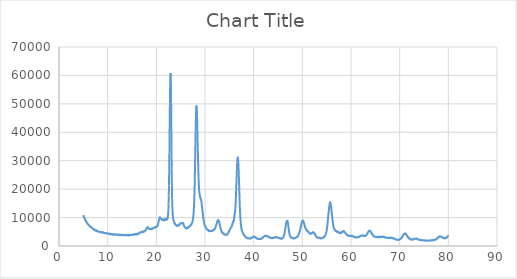
| Category | Series 0 |
|---|---|
| 5.0 | 10862 |
| 5.04 | 10602 |
| 5.08 | 10216 |
| 5.12 | 10194 |
| 5.16 | 10077 |
| 5.2 | 10090 |
| 5.24 | 9739 |
| 5.28 | 9728 |
| 5.32 | 9469 |
| 5.36 | 9317 |
| 5.4 | 9113 |
| 5.44 | 9137 |
| 5.48 | 8998 |
| 5.52 | 8916 |
| 5.56 | 8576 |
| 5.6 | 8645 |
| 5.64 | 8523 |
| 5.68 | 8434 |
| 5.72 | 8157 |
| 5.76 | 8173 |
| 5.8 | 7893 |
| 5.84 | 7918 |
| 5.88 | 7758 |
| 5.92 | 7679 |
| 5.96 | 7673 |
| 6.0 | 7687 |
| 6.04 | 7606 |
| 6.08 | 7361 |
| 6.12 | 7324 |
| 6.16 | 7300 |
| 6.2 | 7283 |
| 6.24 | 7166 |
| 6.28 | 7113 |
| 6.32 | 6834 |
| 6.36 | 6898 |
| 6.4 | 6785 |
| 6.44 | 6750 |
| 6.48 | 6778 |
| 6.52 | 6733 |
| 6.56 | 6751 |
| 6.6 | 6533 |
| 6.64 | 6475 |
| 6.68 | 6540 |
| 6.72 | 6457 |
| 6.76 | 6325 |
| 6.8 | 6323 |
| 6.84 | 6169 |
| 6.88 | 6058 |
| 6.92 | 6093 |
| 6.96 | 6118 |
| 7.0 | 6117 |
| 7.04 | 6037 |
| 7.08 | 6010 |
| 7.12 | 5892 |
| 7.16 | 5725 |
| 7.2 | 5849 |
| 7.24 | 5895 |
| 7.28 | 5747 |
| 7.32 | 5716 |
| 7.36 | 5705 |
| 7.4 | 5432 |
| 7.44 | 5592 |
| 7.48 | 5535 |
| 7.52 | 5392 |
| 7.56 | 5521 |
| 7.6 | 5392 |
| 7.64 | 5516 |
| 7.68 | 5541 |
| 7.72 | 5367 |
| 7.76 | 5412 |
| 7.8 | 5144 |
| 7.84 | 5224 |
| 7.88 | 5275 |
| 7.92 | 5236 |
| 7.96 | 5162 |
| 8.0 | 5179 |
| 8.04 | 5090 |
| 8.08 | 5063 |
| 8.12 | 5085 |
| 8.16 | 5120 |
| 8.2 | 5021 |
| 8.24 | 4968 |
| 8.28 | 4874 |
| 8.32 | 4955 |
| 8.36 | 4914 |
| 8.4 | 4963 |
| 8.44 | 4836 |
| 8.48 | 4874 |
| 8.52 | 4885 |
| 8.56 | 4914 |
| 8.6 | 4904 |
| 8.64 | 4816 |
| 8.68 | 4845 |
| 8.72 | 4829 |
| 8.76 | 4782 |
| 8.8 | 4857 |
| 8.84 | 4798 |
| 8.88 | 4792 |
| 8.92 | 4707 |
| 8.96 | 4732 |
| 9.0 | 4718 |
| 9.04 | 4839 |
| 9.08 | 4691 |
| 9.12 | 4648 |
| 9.16 | 4683 |
| 9.2 | 4551 |
| 9.24 | 4707 |
| 9.28 | 4574 |
| 9.32 | 4594 |
| 9.36 | 4588 |
| 9.4 | 4505 |
| 9.44 | 4561 |
| 9.48 | 4544 |
| 9.52 | 4443 |
| 9.56 | 4509 |
| 9.6 | 4452 |
| 9.64 | 4458 |
| 9.68 | 4550 |
| 9.72 | 4509 |
| 9.76 | 4473 |
| 9.8 | 4422 |
| 9.84 | 4424 |
| 9.88 | 4430 |
| 9.92 | 4418 |
| 9.96 | 4359 |
| 10.0 | 4355 |
| 10.04 | 4425 |
| 10.08 | 4439 |
| 10.12 | 4270 |
| 10.16 | 4288 |
| 10.2 | 4400 |
| 10.24 | 4287 |
| 10.28 | 4296 |
| 10.32 | 4345 |
| 10.36 | 4247 |
| 10.4 | 4330 |
| 10.44 | 4146 |
| 10.48 | 4184 |
| 10.52 | 4122 |
| 10.56 | 4212 |
| 10.6 | 4276 |
| 10.64 | 4188 |
| 10.68 | 4267 |
| 10.72 | 4108 |
| 10.76 | 4065 |
| 10.8 | 4185 |
| 10.84 | 4117 |
| 10.88 | 4182 |
| 10.92 | 4190 |
| 10.96 | 4069 |
| 11.0 | 4174 |
| 11.04 | 4062 |
| 11.08 | 4109 |
| 11.12 | 3894 |
| 11.16 | 4053 |
| 11.2 | 4154 |
| 11.24 | 4186 |
| 11.28 | 4074 |
| 11.32 | 4074 |
| 11.36 | 4028 |
| 11.4 | 4032 |
| 11.44 | 4121 |
| 11.48 | 4061 |
| 11.52 | 4003 |
| 11.56 | 3951 |
| 11.6 | 4024 |
| 11.64 | 4057 |
| 11.68 | 3973 |
| 11.72 | 3982 |
| 11.76 | 3988 |
| 11.8 | 4016 |
| 11.84 | 3958 |
| 11.88 | 4081 |
| 11.92 | 4050 |
| 11.96 | 3971 |
| 12.0 | 3913 |
| 12.04 | 4052 |
| 12.08 | 3912 |
| 12.12 | 3918 |
| 12.16 | 3928 |
| 12.2 | 3906 |
| 12.24 | 3983 |
| 12.28 | 3923 |
| 12.32 | 3877 |
| 12.36 | 3897 |
| 12.4 | 3814 |
| 12.44 | 4002 |
| 12.48 | 3933 |
| 12.52 | 3918 |
| 12.56 | 3882 |
| 12.6 | 3936 |
| 12.64 | 3878 |
| 12.68 | 3915 |
| 12.72 | 3763 |
| 12.76 | 3791 |
| 12.8 | 3916 |
| 12.84 | 3953 |
| 12.88 | 3894 |
| 12.92 | 3820 |
| 12.96 | 3933 |
| 13.0 | 3773 |
| 13.04 | 3789 |
| 13.08 | 3763 |
| 13.12 | 3824 |
| 13.16 | 3860 |
| 13.2 | 3851 |
| 13.24 | 3877 |
| 13.28 | 3862 |
| 13.32 | 3818 |
| 13.36 | 3858 |
| 13.4 | 3787 |
| 13.44 | 3803 |
| 13.48 | 3843 |
| 13.52 | 3880 |
| 13.56 | 3810 |
| 13.6 | 3786 |
| 13.64 | 3774 |
| 13.68 | 3906 |
| 13.72 | 3860 |
| 13.76 | 3906 |
| 13.8 | 3819 |
| 13.84 | 3805 |
| 13.88 | 3752 |
| 13.92 | 3781 |
| 13.96 | 3840 |
| 14.0 | 3863 |
| 14.04 | 3817 |
| 14.08 | 3726 |
| 14.12 | 3924 |
| 14.16 | 3930 |
| 14.2 | 3801 |
| 14.24 | 3910 |
| 14.28 | 3701 |
| 14.32 | 3865 |
| 14.36 | 3774 |
| 14.4 | 3948 |
| 14.44 | 3796 |
| 14.48 | 3986 |
| 14.52 | 3729 |
| 14.56 | 3916 |
| 14.6 | 3921 |
| 14.64 | 3896 |
| 14.68 | 3917 |
| 14.72 | 3892 |
| 14.76 | 3904 |
| 14.8 | 3885 |
| 14.84 | 3860 |
| 14.88 | 3940 |
| 14.92 | 3921 |
| 14.96 | 3915 |
| 15.0 | 3932 |
| 15.04 | 4052 |
| 15.08 | 3915 |
| 15.12 | 3925 |
| 15.16 | 3905 |
| 15.2 | 3981 |
| 15.24 | 4055 |
| 15.28 | 3914 |
| 15.32 | 3976 |
| 15.36 | 3907 |
| 15.4 | 4001 |
| 15.44 | 4011 |
| 15.48 | 4019 |
| 15.52 | 4127 |
| 15.56 | 4002 |
| 15.6 | 4138 |
| 15.64 | 4208 |
| 15.68 | 4037 |
| 15.72 | 4003 |
| 15.76 | 4029 |
| 15.8 | 4037 |
| 15.84 | 4233 |
| 15.88 | 4247 |
| 15.92 | 4234 |
| 15.96 | 4250 |
| 16.0 | 4077 |
| 16.04 | 4169 |
| 16.08 | 4251 |
| 16.12 | 4284 |
| 16.16 | 4100 |
| 16.2 | 4156 |
| 16.24 | 4378 |
| 16.28 | 4248 |
| 16.32 | 4227 |
| 16.36 | 4417 |
| 16.4 | 4485 |
| 16.44 | 4472 |
| 16.48 | 4578 |
| 16.52 | 4537 |
| 16.56 | 4604 |
| 16.6 | 4716 |
| 16.64 | 4626 |
| 16.68 | 4708 |
| 16.72 | 4802 |
| 16.76 | 4833 |
| 16.8 | 4877 |
| 16.84 | 4835 |
| 16.88 | 4877 |
| 16.92 | 4881 |
| 16.96 | 4818 |
| 17.0 | 4897 |
| 17.04 | 4922 |
| 17.08 | 5028 |
| 17.12 | 4904 |
| 17.16 | 5012 |
| 17.2 | 4866 |
| 17.24 | 5032 |
| 17.28 | 5108 |
| 17.32 | 5034 |
| 17.36 | 5120 |
| 17.4 | 4952 |
| 17.44 | 5210 |
| 17.48 | 5017 |
| 17.52 | 5178 |
| 17.56 | 5304 |
| 17.6 | 5297 |
| 17.64 | 5207 |
| 17.68 | 5402 |
| 17.72 | 5324 |
| 17.76 | 5470 |
| 17.8 | 5504 |
| 17.84 | 5783 |
| 17.88 | 5747 |
| 17.92 | 5862 |
| 17.96 | 6055 |
| 18.0 | 6194 |
| 18.04 | 6143 |
| 18.08 | 6476 |
| 18.12 | 6570 |
| 18.16 | 6491 |
| 18.2 | 6648 |
| 18.24 | 6598 |
| 18.28 | 6390 |
| 18.32 | 6555 |
| 18.36 | 6354 |
| 18.4 | 6189 |
| 18.44 | 6196 |
| 18.48 | 5999 |
| 18.52 | 6043 |
| 18.56 | 6017 |
| 18.6 | 6022 |
| 18.64 | 5961 |
| 18.68 | 5984 |
| 18.72 | 5977 |
| 18.76 | 5928 |
| 18.8 | 5862 |
| 18.84 | 5954 |
| 18.88 | 6093 |
| 18.92 | 5928 |
| 18.96 | 6178 |
| 19.0 | 6112 |
| 19.04 | 6005 |
| 19.08 | 6049 |
| 19.12 | 6003 |
| 19.16 | 6028 |
| 19.2 | 6259 |
| 19.24 | 6198 |
| 19.28 | 6130 |
| 19.32 | 6219 |
| 19.36 | 6277 |
| 19.4 | 6349 |
| 19.44 | 6334 |
| 19.48 | 6355 |
| 19.52 | 6400 |
| 19.56 | 6473 |
| 19.6 | 6418 |
| 19.64 | 6424 |
| 19.68 | 6476 |
| 19.72 | 6454 |
| 19.76 | 6530 |
| 19.8 | 6666 |
| 19.84 | 6538 |
| 19.88 | 6582 |
| 19.92 | 6741 |
| 19.96 | 6773 |
| 20.0 | 6723 |
| 20.04 | 6746 |
| 20.08 | 6787 |
| 20.12 | 6926 |
| 20.16 | 6814 |
| 20.2 | 6955 |
| 20.24 | 7171 |
| 20.28 | 7270 |
| 20.32 | 7462 |
| 20.36 | 7758 |
| 20.4 | 8024 |
| 20.44 | 8513 |
| 20.48 | 8620 |
| 20.52 | 8952 |
| 20.56 | 9153 |
| 20.6 | 9650 |
| 20.64 | 9724 |
| 20.68 | 9992 |
| 20.72 | 10135 |
| 20.76 | 10136 |
| 20.8 | 9936 |
| 20.84 | 9952 |
| 20.88 | 9678 |
| 20.92 | 9602 |
| 20.96 | 9713 |
| 21.0 | 9685 |
| 21.04 | 9568 |
| 21.08 | 9372 |
| 21.12 | 9524 |
| 21.16 | 9261 |
| 21.2 | 9161 |
| 21.24 | 9313 |
| 21.28 | 9231 |
| 21.32 | 9121 |
| 21.36 | 9180 |
| 21.4 | 9265 |
| 21.44 | 9156 |
| 21.48 | 9146 |
| 21.52 | 8986 |
| 21.56 | 8941 |
| 21.6 | 8993 |
| 21.64 | 9371 |
| 21.68 | 9420 |
| 21.72 | 9617 |
| 21.76 | 9225 |
| 21.8 | 9286 |
| 21.84 | 9475 |
| 21.88 | 9393 |
| 21.92 | 9488 |
| 21.96 | 9291 |
| 22.0 | 9349 |
| 22.04 | 9193 |
| 22.08 | 9184 |
| 22.12 | 9356 |
| 22.16 | 9381 |
| 22.2 | 9366 |
| 22.24 | 9451 |
| 22.28 | 9588 |
| 22.32 | 9729 |
| 22.36 | 10348 |
| 22.4 | 10933 |
| 22.44 | 11799 |
| 22.48 | 12930 |
| 22.52 | 14975 |
| 22.56 | 17730 |
| 22.6 | 21315 |
| 22.64 | 26408 |
| 22.68 | 32517 |
| 22.72 | 39325 |
| 22.76 | 45615 |
| 22.8 | 51636 |
| 22.84 | 56300 |
| 22.88 | 59660 |
| 22.92 | 60823 |
| 22.96 | 59463 |
| 23.0 | 56002 |
| 23.04 | 50247 |
| 23.08 | 42537 |
| 23.12 | 34187 |
| 23.16 | 26848 |
| 23.2 | 21252 |
| 23.24 | 16734 |
| 23.28 | 14461 |
| 23.32 | 12637 |
| 23.36 | 11551 |
| 23.4 | 10617 |
| 23.44 | 10029 |
| 23.48 | 9452 |
| 23.52 | 9028 |
| 23.56 | 8931 |
| 23.6 | 8782 |
| 23.64 | 8526 |
| 23.68 | 8327 |
| 23.72 | 8164 |
| 23.76 | 7914 |
| 23.8 | 7830 |
| 23.84 | 7879 |
| 23.88 | 7653 |
| 23.92 | 7502 |
| 23.96 | 7391 |
| 24.0 | 7511 |
| 24.04 | 7401 |
| 24.08 | 7406 |
| 24.12 | 7156 |
| 24.16 | 7145 |
| 24.2 | 7100 |
| 24.24 | 7191 |
| 24.28 | 7066 |
| 24.32 | 7188 |
| 24.36 | 7038 |
| 24.4 | 7075 |
| 24.44 | 7127 |
| 24.48 | 7071 |
| 24.52 | 7186 |
| 24.56 | 7268 |
| 24.6 | 7286 |
| 24.64 | 7545 |
| 24.68 | 7361 |
| 24.72 | 7460 |
| 24.76 | 7646 |
| 24.8 | 7685 |
| 24.84 | 7681 |
| 24.88 | 7919 |
| 24.92 | 7905 |
| 24.96 | 7862 |
| 25.0 | 7929 |
| 25.04 | 7839 |
| 25.08 | 7902 |
| 25.12 | 7989 |
| 25.16 | 7968 |
| 25.2 | 7973 |
| 25.24 | 8028 |
| 25.28 | 7952 |
| 25.32 | 7982 |
| 25.36 | 8134 |
| 25.4 | 8095 |
| 25.44 | 8176 |
| 25.48 | 7978 |
| 25.52 | 7810 |
| 25.56 | 7936 |
| 25.6 | 7522 |
| 25.64 | 7371 |
| 25.68 | 7244 |
| 25.72 | 7063 |
| 25.76 | 6911 |
| 25.8 | 6640 |
| 25.84 | 6628 |
| 25.88 | 6624 |
| 25.92 | 6483 |
| 25.96 | 6432 |
| 26.0 | 6491 |
| 26.04 | 6435 |
| 26.08 | 6267 |
| 26.12 | 6297 |
| 26.16 | 6262 |
| 26.2 | 6116 |
| 26.24 | 6231 |
| 26.28 | 6358 |
| 26.32 | 6238 |
| 26.36 | 6374 |
| 26.4 | 6246 |
| 26.44 | 6300 |
| 26.48 | 6620 |
| 26.52 | 6539 |
| 26.56 | 6506 |
| 26.6 | 6534 |
| 26.64 | 6663 |
| 26.68 | 6748 |
| 26.72 | 6641 |
| 26.76 | 6819 |
| 26.8 | 6713 |
| 26.84 | 6847 |
| 26.88 | 6999 |
| 26.92 | 7072 |
| 26.96 | 7058 |
| 27.0 | 7259 |
| 27.04 | 7234 |
| 27.08 | 7358 |
| 27.12 | 7487 |
| 27.16 | 7379 |
| 27.2 | 7524 |
| 27.24 | 7767 |
| 27.28 | 7819 |
| 27.32 | 8024 |
| 27.36 | 8139 |
| 27.4 | 8377 |
| 27.44 | 8628 |
| 27.48 | 8961 |
| 27.52 | 9473 |
| 27.56 | 9739 |
| 27.6 | 10560 |
| 27.64 | 11195 |
| 27.68 | 12100 |
| 27.72 | 13473 |
| 27.76 | 14872 |
| 27.8 | 16775 |
| 27.84 | 19253 |
| 27.88 | 21903 |
| 27.92 | 25263 |
| 27.96 | 29350 |
| 28.0 | 33043 |
| 28.04 | 36657 |
| 28.08 | 40599 |
| 28.12 | 43810 |
| 28.16 | 46409 |
| 28.2 | 48280 |
| 28.24 | 49410 |
| 28.28 | 48979 |
| 28.32 | 48012 |
| 28.36 | 46016 |
| 28.4 | 43648 |
| 28.44 | 40102 |
| 28.48 | 37020 |
| 28.52 | 33798 |
| 28.56 | 31120 |
| 28.6 | 28191 |
| 28.64 | 25703 |
| 28.68 | 23953 |
| 28.72 | 21991 |
| 28.76 | 20804 |
| 28.8 | 19564 |
| 28.84 | 18784 |
| 28.88 | 18474 |
| 28.92 | 17551 |
| 28.96 | 17674 |
| 29.0 | 17280 |
| 29.04 | 16935 |
| 29.08 | 16713 |
| 29.12 | 16831 |
| 29.16 | 16211 |
| 29.2 | 16225 |
| 29.24 | 15604 |
| 29.28 | 15369 |
| 29.32 | 14886 |
| 29.36 | 14091 |
| 29.4 | 13743 |
| 29.44 | 12969 |
| 29.48 | 12473 |
| 29.52 | 11709 |
| 29.56 | 11261 |
| 29.6 | 10525 |
| 29.64 | 9932 |
| 29.68 | 9616 |
| 29.72 | 9169 |
| 29.76 | 8869 |
| 29.8 | 8317 |
| 29.84 | 7916 |
| 29.88 | 7638 |
| 29.92 | 7383 |
| 29.96 | 7267 |
| 30.0 | 7056 |
| 30.04 | 7011 |
| 30.08 | 6811 |
| 30.12 | 6573 |
| 30.16 | 6306 |
| 30.2 | 6325 |
| 30.24 | 6263 |
| 30.28 | 6045 |
| 30.32 | 6033 |
| 30.36 | 6025 |
| 30.4 | 5885 |
| 30.44 | 5848 |
| 30.48 | 5751 |
| 30.52 | 5715 |
| 30.56 | 5517 |
| 30.6 | 5551 |
| 30.64 | 5634 |
| 30.68 | 5422 |
| 30.72 | 5507 |
| 30.76 | 5392 |
| 30.8 | 5229 |
| 30.84 | 5264 |
| 30.88 | 5370 |
| 30.92 | 5394 |
| 30.96 | 5340 |
| 31.0 | 5188 |
| 31.04 | 5329 |
| 31.08 | 5326 |
| 31.12 | 5325 |
| 31.16 | 5311 |
| 31.2 | 5281 |
| 31.24 | 5242 |
| 31.28 | 5260 |
| 31.32 | 5265 |
| 31.36 | 5376 |
| 31.4 | 5428 |
| 31.44 | 5274 |
| 31.48 | 5422 |
| 31.52 | 5396 |
| 31.56 | 5493 |
| 31.6 | 5337 |
| 31.64 | 5554 |
| 31.68 | 5524 |
| 31.72 | 5572 |
| 31.76 | 5618 |
| 31.8 | 5627 |
| 31.84 | 5830 |
| 31.88 | 5785 |
| 31.92 | 5814 |
| 31.96 | 5960 |
| 32.0 | 5994 |
| 32.04 | 6157 |
| 32.08 | 6177 |
| 32.12 | 6411 |
| 32.16 | 6600 |
| 32.2 | 6734 |
| 32.24 | 7041 |
| 32.28 | 7241 |
| 32.32 | 7490 |
| 32.36 | 7640 |
| 32.4 | 7909 |
| 32.44 | 8073 |
| 32.48 | 8545 |
| 32.52 | 8721 |
| 32.56 | 8607 |
| 32.6 | 8871 |
| 32.64 | 8843 |
| 32.68 | 9086 |
| 32.72 | 9181 |
| 32.76 | 9028 |
| 32.8 | 8974 |
| 32.84 | 8824 |
| 32.88 | 8591 |
| 32.92 | 8308 |
| 32.96 | 8108 |
| 33.0 | 7873 |
| 33.04 | 7582 |
| 33.08 | 7245 |
| 33.12 | 6879 |
| 33.16 | 6391 |
| 33.2 | 6194 |
| 33.24 | 6182 |
| 33.28 | 5792 |
| 33.32 | 5457 |
| 33.36 | 5278 |
| 33.4 | 5374 |
| 33.44 | 5072 |
| 33.48 | 4734 |
| 33.52 | 4683 |
| 33.56 | 4712 |
| 33.6 | 4643 |
| 33.64 | 4526 |
| 33.68 | 4451 |
| 33.72 | 4383 |
| 33.76 | 4447 |
| 33.8 | 4332 |
| 33.84 | 4206 |
| 33.88 | 4223 |
| 33.92 | 4079 |
| 33.96 | 4031 |
| 34.0 | 4028 |
| 34.04 | 4049 |
| 34.08 | 4148 |
| 34.12 | 3954 |
| 34.16 | 3917 |
| 34.2 | 3945 |
| 34.24 | 3964 |
| 34.28 | 3912 |
| 34.32 | 3850 |
| 34.36 | 3953 |
| 34.4 | 3934 |
| 34.44 | 4054 |
| 34.48 | 3971 |
| 34.52 | 4134 |
| 34.56 | 4055 |
| 34.6 | 4117 |
| 34.64 | 4310 |
| 34.68 | 4340 |
| 34.72 | 4437 |
| 34.76 | 4518 |
| 34.8 | 4699 |
| 34.84 | 5038 |
| 34.88 | 4858 |
| 34.92 | 5054 |
| 34.96 | 5188 |
| 35.0 | 5371 |
| 35.04 | 5476 |
| 35.08 | 5724 |
| 35.12 | 5734 |
| 35.16 | 5936 |
| 35.2 | 6094 |
| 35.24 | 6217 |
| 35.28 | 6417 |
| 35.32 | 6395 |
| 35.36 | 6619 |
| 35.4 | 6726 |
| 35.44 | 6720 |
| 35.48 | 6744 |
| 35.52 | 7058 |
| 35.56 | 7322 |
| 35.6 | 7345 |
| 35.64 | 7879 |
| 35.68 | 7787 |
| 35.72 | 8297 |
| 35.76 | 8522 |
| 35.8 | 8394 |
| 35.84 | 8671 |
| 35.88 | 8923 |
| 35.92 | 8858 |
| 35.96 | 9440 |
| 36.0 | 10043 |
| 36.04 | 10629 |
| 36.08 | 11024 |
| 36.12 | 11552 |
| 36.16 | 11800 |
| 36.2 | 12328 |
| 36.24 | 13220 |
| 36.28 | 14547 |
| 36.32 | 15983 |
| 36.36 | 17810 |
| 36.4 | 19511 |
| 36.44 | 21617 |
| 36.48 | 23228 |
| 36.52 | 25202 |
| 36.56 | 27263 |
| 36.6 | 28863 |
| 36.64 | 29974 |
| 36.68 | 30898 |
| 36.72 | 31225 |
| 36.76 | 31378 |
| 36.8 | 30518 |
| 36.84 | 29903 |
| 36.88 | 28145 |
| 36.92 | 26495 |
| 36.96 | 24387 |
| 37.0 | 22163 |
| 37.04 | 19894 |
| 37.08 | 17677 |
| 37.12 | 15561 |
| 37.16 | 13697 |
| 37.2 | 12063 |
| 37.24 | 10801 |
| 37.28 | 9671 |
| 37.32 | 8833 |
| 37.36 | 7903 |
| 37.4 | 7235 |
| 37.44 | 6740 |
| 37.48 | 6161 |
| 37.52 | 5883 |
| 37.56 | 5547 |
| 37.6 | 5445 |
| 37.64 | 5092 |
| 37.68 | 4988 |
| 37.72 | 4843 |
| 37.76 | 4516 |
| 37.8 | 4469 |
| 37.84 | 4419 |
| 37.88 | 4270 |
| 37.92 | 4145 |
| 37.96 | 4028 |
| 38.0 | 3836 |
| 38.04 | 3937 |
| 38.08 | 3708 |
| 38.12 | 3629 |
| 38.16 | 3513 |
| 38.2 | 3407 |
| 38.24 | 3451 |
| 38.28 | 3299 |
| 38.32 | 3255 |
| 38.36 | 3159 |
| 38.4 | 3065 |
| 38.44 | 3055 |
| 38.48 | 2941 |
| 38.52 | 2988 |
| 38.56 | 2993 |
| 38.6 | 2845 |
| 38.64 | 2859 |
| 38.68 | 2806 |
| 38.72 | 2803 |
| 38.76 | 2738 |
| 38.8 | 2761 |
| 38.84 | 2723 |
| 38.88 | 2680 |
| 38.92 | 2624 |
| 38.96 | 2671 |
| 39.0 | 2670 |
| 39.04 | 2719 |
| 39.08 | 2634 |
| 39.12 | 2688 |
| 39.16 | 2614 |
| 39.2 | 2708 |
| 39.24 | 2694 |
| 39.28 | 2695 |
| 39.32 | 2556 |
| 39.36 | 2688 |
| 39.4 | 2699 |
| 39.44 | 2768 |
| 39.48 | 2766 |
| 39.52 | 2885 |
| 39.56 | 2762 |
| 39.6 | 2863 |
| 39.64 | 2862 |
| 39.68 | 2942 |
| 39.72 | 3004 |
| 39.76 | 3042 |
| 39.8 | 3143 |
| 39.84 | 3126 |
| 39.88 | 3234 |
| 39.92 | 3243 |
| 39.96 | 3299 |
| 40.0 | 3307 |
| 40.04 | 3166 |
| 40.08 | 3363 |
| 40.12 | 3196 |
| 40.16 | 3240 |
| 40.2 | 3112 |
| 40.24 | 3157 |
| 40.28 | 3077 |
| 40.32 | 3159 |
| 40.36 | 3084 |
| 40.4 | 2991 |
| 40.44 | 2924 |
| 40.48 | 2943 |
| 40.52 | 2779 |
| 40.56 | 2789 |
| 40.6 | 2769 |
| 40.64 | 2611 |
| 40.68 | 2627 |
| 40.72 | 2662 |
| 40.76 | 2508 |
| 40.8 | 2496 |
| 40.84 | 2490 |
| 40.88 | 2501 |
| 40.92 | 2476 |
| 40.96 | 2529 |
| 41.0 | 2475 |
| 41.04 | 2416 |
| 41.08 | 2500 |
| 41.12 | 2467 |
| 41.16 | 2454 |
| 41.2 | 2499 |
| 41.24 | 2479 |
| 41.28 | 2503 |
| 41.32 | 2451 |
| 41.36 | 2472 |
| 41.4 | 2429 |
| 41.44 | 2528 |
| 41.48 | 2556 |
| 41.52 | 2459 |
| 41.56 | 2592 |
| 41.6 | 2723 |
| 41.64 | 2615 |
| 41.68 | 2702 |
| 41.72 | 2760 |
| 41.76 | 2683 |
| 41.8 | 2771 |
| 41.84 | 2902 |
| 41.88 | 2951 |
| 41.92 | 3040 |
| 41.96 | 3123 |
| 42.0 | 3180 |
| 42.04 | 3166 |
| 42.08 | 3251 |
| 42.12 | 3333 |
| 42.16 | 3385 |
| 42.2 | 3469 |
| 42.24 | 3464 |
| 42.28 | 3498 |
| 42.32 | 3485 |
| 42.36 | 3632 |
| 42.4 | 3632 |
| 42.44 | 3562 |
| 42.48 | 3618 |
| 42.52 | 3518 |
| 42.56 | 3617 |
| 42.6 | 3621 |
| 42.64 | 3530 |
| 42.68 | 3502 |
| 42.72 | 3596 |
| 42.76 | 3523 |
| 42.8 | 3436 |
| 42.84 | 3434 |
| 42.88 | 3367 |
| 42.92 | 3361 |
| 42.96 | 3296 |
| 43.0 | 3201 |
| 43.04 | 3238 |
| 43.08 | 3272 |
| 43.12 | 3244 |
| 43.16 | 3171 |
| 43.2 | 3063 |
| 43.24 | 3137 |
| 43.28 | 2957 |
| 43.32 | 3047 |
| 43.36 | 2986 |
| 43.4 | 2879 |
| 43.44 | 2881 |
| 43.48 | 2863 |
| 43.52 | 2834 |
| 43.56 | 2785 |
| 43.6 | 2907 |
| 43.64 | 2847 |
| 43.68 | 2815 |
| 43.72 | 2851 |
| 43.76 | 2778 |
| 43.8 | 2753 |
| 43.84 | 2732 |
| 43.88 | 2748 |
| 43.92 | 2798 |
| 43.96 | 2869 |
| 44.0 | 2834 |
| 44.04 | 2781 |
| 44.08 | 2835 |
| 44.12 | 2900 |
| 44.16 | 2916 |
| 44.2 | 2914 |
| 44.24 | 2876 |
| 44.28 | 2895 |
| 44.32 | 3049 |
| 44.36 | 2944 |
| 44.4 | 3063 |
| 44.44 | 3015 |
| 44.48 | 3210 |
| 44.52 | 3049 |
| 44.56 | 3084 |
| 44.6 | 3035 |
| 44.64 | 3017 |
| 44.68 | 3105 |
| 44.72 | 3050 |
| 44.76 | 3134 |
| 44.8 | 2989 |
| 44.84 | 3084 |
| 44.88 | 2962 |
| 44.92 | 2935 |
| 44.96 | 2985 |
| 45.0 | 2933 |
| 45.04 | 2932 |
| 45.08 | 2845 |
| 45.12 | 2863 |
| 45.16 | 2870 |
| 45.2 | 2818 |
| 45.24 | 2798 |
| 45.28 | 2672 |
| 45.32 | 2792 |
| 45.36 | 2635 |
| 45.4 | 2656 |
| 45.44 | 2686 |
| 45.48 | 2589 |
| 45.52 | 2687 |
| 45.56 | 2741 |
| 45.6 | 2678 |
| 45.64 | 2688 |
| 45.68 | 2481 |
| 45.72 | 2680 |
| 45.76 | 2708 |
| 45.8 | 2597 |
| 45.84 | 2671 |
| 45.88 | 2693 |
| 45.92 | 2721 |
| 45.96 | 2796 |
| 46.0 | 2782 |
| 46.04 | 2926 |
| 46.08 | 2994 |
| 46.12 | 3173 |
| 46.16 | 3291 |
| 46.2 | 3494 |
| 46.24 | 3748 |
| 46.28 | 3994 |
| 46.32 | 4272 |
| 46.36 | 4614 |
| 46.4 | 5074 |
| 46.44 | 5642 |
| 46.48 | 6036 |
| 46.52 | 6462 |
| 46.56 | 6786 |
| 46.6 | 7306 |
| 46.64 | 7663 |
| 46.68 | 8066 |
| 46.72 | 8324 |
| 46.76 | 8556 |
| 46.8 | 8746 |
| 46.84 | 8890 |
| 46.88 | 8894 |
| 46.92 | 8880 |
| 46.96 | 8790 |
| 47.0 | 8380 |
| 47.04 | 8091 |
| 47.08 | 7645 |
| 47.12 | 7082 |
| 47.16 | 6425 |
| 47.2 | 5942 |
| 47.24 | 5417 |
| 47.28 | 4949 |
| 47.32 | 4569 |
| 47.36 | 4231 |
| 47.4 | 3963 |
| 47.44 | 3672 |
| 47.48 | 3441 |
| 47.52 | 3357 |
| 47.56 | 3305 |
| 47.6 | 3119 |
| 47.64 | 3010 |
| 47.68 | 2950 |
| 47.72 | 2893 |
| 47.76 | 2952 |
| 47.8 | 2768 |
| 47.84 | 2811 |
| 47.88 | 2712 |
| 47.92 | 2745 |
| 47.96 | 2759 |
| 48.0 | 2712 |
| 48.04 | 2735 |
| 48.08 | 2838 |
| 48.12 | 2773 |
| 48.16 | 2628 |
| 48.2 | 2759 |
| 48.24 | 2730 |
| 48.28 | 2648 |
| 48.32 | 2706 |
| 48.36 | 2738 |
| 48.4 | 2741 |
| 48.44 | 2783 |
| 48.48 | 2803 |
| 48.52 | 2833 |
| 48.56 | 3001 |
| 48.6 | 2825 |
| 48.64 | 2841 |
| 48.68 | 2870 |
| 48.72 | 3003 |
| 48.76 | 3030 |
| 48.8 | 3109 |
| 48.84 | 3118 |
| 48.88 | 3226 |
| 48.92 | 3173 |
| 48.96 | 3213 |
| 49.0 | 3445 |
| 49.04 | 3353 |
| 49.08 | 3568 |
| 49.12 | 3726 |
| 49.16 | 3804 |
| 49.2 | 3889 |
| 49.24 | 4081 |
| 49.28 | 4289 |
| 49.32 | 4370 |
| 49.36 | 4616 |
| 49.4 | 4709 |
| 49.44 | 5083 |
| 49.48 | 5297 |
| 49.52 | 5713 |
| 49.56 | 5797 |
| 49.6 | 6127 |
| 49.64 | 6508 |
| 49.68 | 6591 |
| 49.72 | 7147 |
| 49.76 | 7344 |
| 49.8 | 7618 |
| 49.84 | 7982 |
| 49.88 | 8262 |
| 49.92 | 8448 |
| 49.96 | 8622 |
| 50.0 | 8843 |
| 50.04 | 8819 |
| 50.08 | 8964 |
| 50.12 | 8785 |
| 50.16 | 8953 |
| 50.2 | 8715 |
| 50.24 | 8671 |
| 50.28 | 8337 |
| 50.32 | 8196 |
| 50.36 | 7848 |
| 50.4 | 7571 |
| 50.44 | 7424 |
| 50.48 | 7190 |
| 50.52 | 6737 |
| 50.56 | 6735 |
| 50.6 | 6545 |
| 50.64 | 6294 |
| 50.68 | 6176 |
| 50.72 | 6130 |
| 50.76 | 5839 |
| 50.8 | 5853 |
| 50.84 | 5729 |
| 50.88 | 5585 |
| 50.92 | 5627 |
| 50.96 | 5376 |
| 51.0 | 5416 |
| 51.04 | 5229 |
| 51.08 | 5316 |
| 51.12 | 5160 |
| 51.16 | 5164 |
| 51.2 | 4943 |
| 51.24 | 5002 |
| 51.28 | 4847 |
| 51.32 | 4759 |
| 51.36 | 4827 |
| 51.4 | 4589 |
| 51.44 | 4578 |
| 51.48 | 4486 |
| 51.52 | 4484 |
| 51.56 | 4451 |
| 51.6 | 4439 |
| 51.64 | 4199 |
| 51.68 | 4392 |
| 51.72 | 4317 |
| 51.76 | 4371 |
| 51.8 | 4325 |
| 51.84 | 4449 |
| 51.88 | 4448 |
| 51.92 | 4430 |
| 51.96 | 4495 |
| 52.0 | 4663 |
| 52.04 | 4706 |
| 52.08 | 4636 |
| 52.12 | 4862 |
| 52.16 | 4799 |
| 52.2 | 4851 |
| 52.24 | 4769 |
| 52.28 | 4815 |
| 52.32 | 4638 |
| 52.36 | 4725 |
| 52.4 | 4610 |
| 52.44 | 4472 |
| 52.48 | 4398 |
| 52.52 | 4414 |
| 52.56 | 4216 |
| 52.6 | 3979 |
| 52.64 | 4068 |
| 52.68 | 3805 |
| 52.72 | 3687 |
| 52.76 | 3604 |
| 52.8 | 3435 |
| 52.84 | 3400 |
| 52.88 | 3237 |
| 52.92 | 3244 |
| 52.96 | 3048 |
| 53.0 | 3135 |
| 53.04 | 3168 |
| 53.08 | 3036 |
| 53.12 | 3043 |
| 53.16 | 2915 |
| 53.2 | 3004 |
| 53.24 | 2897 |
| 53.28 | 2906 |
| 53.32 | 2834 |
| 53.36 | 2928 |
| 53.4 | 2886 |
| 53.44 | 2862 |
| 53.48 | 2808 |
| 53.52 | 2853 |
| 53.56 | 2898 |
| 53.6 | 2904 |
| 53.64 | 2679 |
| 53.68 | 2770 |
| 53.72 | 2842 |
| 53.76 | 2766 |
| 53.8 | 2659 |
| 53.84 | 2684 |
| 53.88 | 2695 |
| 53.92 | 2739 |
| 53.96 | 2727 |
| 54.0 | 2767 |
| 54.04 | 2815 |
| 54.08 | 2773 |
| 54.12 | 2741 |
| 54.16 | 2921 |
| 54.2 | 2776 |
| 54.24 | 2933 |
| 54.28 | 2965 |
| 54.32 | 2947 |
| 54.36 | 3126 |
| 54.4 | 3087 |
| 54.44 | 3102 |
| 54.48 | 3259 |
| 54.52 | 3202 |
| 54.56 | 3344 |
| 54.6 | 3463 |
| 54.64 | 3579 |
| 54.68 | 3594 |
| 54.72 | 3705 |
| 54.76 | 3850 |
| 54.8 | 4165 |
| 54.84 | 4396 |
| 54.88 | 4539 |
| 54.92 | 4832 |
| 54.96 | 5084 |
| 55.0 | 5397 |
| 55.04 | 5897 |
| 55.08 | 6400 |
| 55.12 | 6968 |
| 55.16 | 7412 |
| 55.2 | 8260 |
| 55.24 | 8993 |
| 55.28 | 9755 |
| 55.32 | 10562 |
| 55.36 | 11310 |
| 55.4 | 11792 |
| 55.44 | 12423 |
| 55.48 | 13105 |
| 55.52 | 13855 |
| 55.56 | 14017 |
| 55.6 | 14732 |
| 55.64 | 14919 |
| 55.68 | 15388 |
| 55.72 | 15306 |
| 55.76 | 15146 |
| 55.8 | 15053 |
| 55.84 | 14686 |
| 55.88 | 14308 |
| 55.92 | 13886 |
| 55.96 | 13023 |
| 56.0 | 12584 |
| 56.04 | 11722 |
| 56.08 | 11050 |
| 56.12 | 10450 |
| 56.16 | 9653 |
| 56.2 | 9191 |
| 56.24 | 8673 |
| 56.28 | 8113 |
| 56.32 | 7433 |
| 56.36 | 7342 |
| 56.4 | 6977 |
| 56.44 | 6495 |
| 56.48 | 6362 |
| 56.52 | 6195 |
| 56.56 | 6064 |
| 56.6 | 5947 |
| 56.64 | 5878 |
| 56.68 | 5694 |
| 56.72 | 5515 |
| 56.76 | 5426 |
| 56.8 | 5419 |
| 56.84 | 5284 |
| 56.88 | 5356 |
| 56.92 | 5273 |
| 56.96 | 5322 |
| 57.0 | 5187 |
| 57.04 | 5200 |
| 57.08 | 5099 |
| 57.12 | 5001 |
| 57.16 | 4862 |
| 57.2 | 4924 |
| 57.24 | 4912 |
| 57.28 | 4915 |
| 57.32 | 4999 |
| 57.36 | 4872 |
| 57.4 | 4909 |
| 57.44 | 4717 |
| 57.48 | 4915 |
| 57.52 | 4694 |
| 57.56 | 4646 |
| 57.6 | 4525 |
| 57.64 | 4653 |
| 57.68 | 4588 |
| 57.72 | 4455 |
| 57.76 | 4572 |
| 57.8 | 4643 |
| 57.84 | 4462 |
| 57.88 | 4548 |
| 57.92 | 4523 |
| 57.96 | 4532 |
| 58.0 | 4736 |
| 58.04 | 4788 |
| 58.08 | 4913 |
| 58.12 | 4865 |
| 58.16 | 4881 |
| 58.2 | 4980 |
| 58.24 | 5004 |
| 58.28 | 5110 |
| 58.32 | 5095 |
| 58.36 | 5264 |
| 58.4 | 5184 |
| 58.44 | 5237 |
| 58.48 | 5166 |
| 58.52 | 5177 |
| 58.56 | 5233 |
| 58.6 | 5078 |
| 58.64 | 5089 |
| 58.68 | 4773 |
| 58.72 | 4730 |
| 58.76 | 4656 |
| 58.8 | 4701 |
| 58.84 | 4562 |
| 58.88 | 4418 |
| 58.92 | 4366 |
| 58.96 | 4224 |
| 59.0 | 4245 |
| 59.04 | 4097 |
| 59.08 | 4037 |
| 59.12 | 3948 |
| 59.16 | 3896 |
| 59.2 | 3790 |
| 59.24 | 3891 |
| 59.28 | 3807 |
| 59.32 | 3643 |
| 59.36 | 3845 |
| 59.4 | 3629 |
| 59.44 | 3647 |
| 59.48 | 3567 |
| 59.52 | 3612 |
| 59.56 | 3623 |
| 59.6 | 3607 |
| 59.64 | 3552 |
| 59.68 | 3606 |
| 59.72 | 3512 |
| 59.76 | 3578 |
| 59.8 | 3603 |
| 59.84 | 3536 |
| 59.88 | 3512 |
| 59.92 | 3654 |
| 59.96 | 3615 |
| 60.0 | 3555 |
| 60.04 | 3451 |
| 60.08 | 3601 |
| 60.12 | 3540 |
| 60.16 | 3478 |
| 60.2 | 3640 |
| 60.24 | 3522 |
| 60.28 | 3466 |
| 60.32 | 3478 |
| 60.36 | 3475 |
| 60.4 | 3346 |
| 60.44 | 3315 |
| 60.48 | 3376 |
| 60.52 | 3330 |
| 60.56 | 3355 |
| 60.6 | 3276 |
| 60.64 | 3248 |
| 60.68 | 3147 |
| 60.72 | 3284 |
| 60.76 | 3087 |
| 60.8 | 3184 |
| 60.84 | 3025 |
| 60.88 | 3140 |
| 60.92 | 2991 |
| 60.96 | 3035 |
| 61.0 | 2979 |
| 61.04 | 3069 |
| 61.08 | 3109 |
| 61.12 | 3035 |
| 61.16 | 3001 |
| 61.2 | 3038 |
| 61.24 | 3010 |
| 61.28 | 3053 |
| 61.32 | 3110 |
| 61.36 | 3046 |
| 61.4 | 3140 |
| 61.44 | 3046 |
| 61.48 | 3191 |
| 61.52 | 3151 |
| 61.56 | 3197 |
| 61.6 | 3291 |
| 61.64 | 3167 |
| 61.68 | 3203 |
| 61.72 | 3262 |
| 61.76 | 3354 |
| 61.8 | 3327 |
| 61.84 | 3498 |
| 61.88 | 3519 |
| 61.92 | 3499 |
| 61.96 | 3524 |
| 62.0 | 3608 |
| 62.04 | 3682 |
| 62.08 | 3687 |
| 62.12 | 3601 |
| 62.16 | 3587 |
| 62.2 | 3666 |
| 62.24 | 3679 |
| 62.28 | 3653 |
| 62.32 | 3723 |
| 62.36 | 3711 |
| 62.4 | 3734 |
| 62.44 | 3721 |
| 62.48 | 3737 |
| 62.52 | 3565 |
| 62.56 | 3656 |
| 62.6 | 3569 |
| 62.64 | 3560 |
| 62.68 | 3543 |
| 62.72 | 3453 |
| 62.76 | 3526 |
| 62.8 | 3529 |
| 62.84 | 3525 |
| 62.88 | 3642 |
| 62.92 | 3524 |
| 62.96 | 3557 |
| 63.0 | 3592 |
| 63.04 | 3600 |
| 63.08 | 3727 |
| 63.12 | 3791 |
| 63.16 | 3832 |
| 63.2 | 3864 |
| 63.24 | 4113 |
| 63.28 | 4134 |
| 63.32 | 4244 |
| 63.36 | 4387 |
| 63.4 | 4545 |
| 63.44 | 4579 |
| 63.48 | 4753 |
| 63.52 | 4955 |
| 63.56 | 4993 |
| 63.6 | 5151 |
| 63.64 | 5159 |
| 63.68 | 5227 |
| 63.72 | 5334 |
| 63.76 | 5307 |
| 63.8 | 5394 |
| 63.84 | 5424 |
| 63.88 | 5341 |
| 63.92 | 5151 |
| 63.96 | 5225 |
| 64.0 | 5173 |
| 64.04 | 5077 |
| 64.08 | 5070 |
| 64.12 | 4889 |
| 64.16 | 4680 |
| 64.2 | 4626 |
| 64.24 | 4457 |
| 64.28 | 4326 |
| 64.32 | 4370 |
| 64.36 | 4135 |
| 64.4 | 4003 |
| 64.44 | 3934 |
| 64.48 | 3753 |
| 64.52 | 3833 |
| 64.56 | 3745 |
| 64.6 | 3564 |
| 64.64 | 3573 |
| 64.68 | 3505 |
| 64.72 | 3384 |
| 64.76 | 3316 |
| 64.8 | 3384 |
| 64.84 | 3249 |
| 64.88 | 3221 |
| 64.92 | 3298 |
| 64.96 | 3280 |
| 65.0 | 3282 |
| 65.04 | 3208 |
| 65.08 | 3164 |
| 65.12 | 3128 |
| 65.16 | 3232 |
| 65.2 | 3195 |
| 65.24 | 3127 |
| 65.28 | 3133 |
| 65.32 | 3189 |
| 65.36 | 3151 |
| 65.4 | 3170 |
| 65.44 | 3066 |
| 65.48 | 3100 |
| 65.52 | 3040 |
| 65.56 | 3100 |
| 65.6 | 3090 |
| 65.64 | 3052 |
| 65.68 | 3296 |
| 65.72 | 3200 |
| 65.76 | 3088 |
| 65.8 | 3170 |
| 65.84 | 3266 |
| 65.88 | 3173 |
| 65.92 | 3148 |
| 65.96 | 3121 |
| 66.0 | 3081 |
| 66.04 | 3127 |
| 66.08 | 3142 |
| 66.12 | 3204 |
| 66.16 | 3193 |
| 66.2 | 3233 |
| 66.24 | 3152 |
| 66.28 | 3132 |
| 66.32 | 3215 |
| 66.36 | 3350 |
| 66.4 | 3153 |
| 66.44 | 3183 |
| 66.48 | 3232 |
| 66.52 | 3269 |
| 66.56 | 3249 |
| 66.6 | 3296 |
| 66.64 | 3304 |
| 66.68 | 3165 |
| 66.72 | 3180 |
| 66.76 | 3210 |
| 66.8 | 3237 |
| 66.84 | 3188 |
| 66.88 | 3082 |
| 66.92 | 3044 |
| 66.96 | 3013 |
| 67.0 | 3145 |
| 67.04 | 3078 |
| 67.08 | 2960 |
| 67.12 | 2993 |
| 67.16 | 2936 |
| 67.2 | 3000 |
| 67.24 | 2967 |
| 67.28 | 2902 |
| 67.32 | 2941 |
| 67.36 | 2842 |
| 67.4 | 2838 |
| 67.44 | 2948 |
| 67.48 | 2874 |
| 67.52 | 2794 |
| 67.56 | 2933 |
| 67.6 | 2791 |
| 67.64 | 2925 |
| 67.68 | 2836 |
| 67.72 | 2889 |
| 67.76 | 2855 |
| 67.8 | 2843 |
| 67.84 | 2895 |
| 67.88 | 2806 |
| 67.92 | 2885 |
| 67.96 | 2900 |
| 68.0 | 2845 |
| 68.04 | 2846 |
| 68.08 | 2872 |
| 68.12 | 2851 |
| 68.16 | 2968 |
| 68.2 | 2944 |
| 68.24 | 2925 |
| 68.28 | 2860 |
| 68.32 | 2823 |
| 68.36 | 2874 |
| 68.4 | 2937 |
| 68.44 | 2850 |
| 68.48 | 2880 |
| 68.52 | 2727 |
| 68.56 | 2747 |
| 68.6 | 2661 |
| 68.64 | 2796 |
| 68.68 | 2698 |
| 68.72 | 2740 |
| 68.76 | 2619 |
| 68.8 | 2699 |
| 68.84 | 2578 |
| 68.88 | 2520 |
| 68.92 | 2509 |
| 68.96 | 2534 |
| 69.0 | 2490 |
| 69.04 | 2456 |
| 69.08 | 2481 |
| 69.12 | 2425 |
| 69.16 | 2370 |
| 69.2 | 2347 |
| 69.24 | 2289 |
| 69.28 | 2205 |
| 69.32 | 2299 |
| 69.36 | 2315 |
| 69.4 | 2307 |
| 69.44 | 2217 |
| 69.48 | 2290 |
| 69.52 | 2156 |
| 69.56 | 2135 |
| 69.6 | 2136 |
| 69.64 | 2180 |
| 69.68 | 2151 |
| 69.72 | 2121 |
| 69.76 | 2220 |
| 69.8 | 2173 |
| 69.84 | 2265 |
| 69.88 | 2284 |
| 69.92 | 2371 |
| 69.96 | 2328 |
| 70.0 | 2295 |
| 70.04 | 2358 |
| 70.08 | 2386 |
| 70.12 | 2392 |
| 70.16 | 2554 |
| 70.2 | 2590 |
| 70.24 | 2632 |
| 70.28 | 2654 |
| 70.32 | 2803 |
| 70.36 | 2787 |
| 70.4 | 2913 |
| 70.44 | 2942 |
| 70.48 | 3032 |
| 70.52 | 3240 |
| 70.56 | 3229 |
| 70.6 | 3523 |
| 70.64 | 3485 |
| 70.68 | 3706 |
| 70.72 | 3731 |
| 70.76 | 3901 |
| 70.8 | 3960 |
| 70.84 | 4163 |
| 70.88 | 4074 |
| 70.92 | 4238 |
| 70.96 | 4347 |
| 71.0 | 4341 |
| 71.04 | 4395 |
| 71.08 | 4452 |
| 71.12 | 4326 |
| 71.16 | 4371 |
| 71.2 | 4358 |
| 71.24 | 4256 |
| 71.28 | 4128 |
| 71.32 | 3997 |
| 71.36 | 4001 |
| 71.4 | 3918 |
| 71.44 | 3901 |
| 71.48 | 3630 |
| 71.52 | 3438 |
| 71.56 | 3463 |
| 71.6 | 3460 |
| 71.64 | 3208 |
| 71.68 | 3168 |
| 71.72 | 3095 |
| 71.76 | 3062 |
| 71.8 | 2842 |
| 71.84 | 2807 |
| 71.88 | 2799 |
| 71.92 | 2604 |
| 71.96 | 2610 |
| 72.0 | 2624 |
| 72.04 | 2695 |
| 72.08 | 2548 |
| 72.12 | 2452 |
| 72.16 | 2363 |
| 72.2 | 2391 |
| 72.24 | 2412 |
| 72.28 | 2324 |
| 72.32 | 2349 |
| 72.36 | 2314 |
| 72.4 | 2306 |
| 72.44 | 2364 |
| 72.48 | 2218 |
| 72.52 | 2256 |
| 72.56 | 2258 |
| 72.6 | 2365 |
| 72.64 | 2337 |
| 72.68 | 2220 |
| 72.72 | 2261 |
| 72.76 | 2343 |
| 72.8 | 2403 |
| 72.84 | 2412 |
| 72.88 | 2372 |
| 72.92 | 2479 |
| 72.96 | 2475 |
| 73.0 | 2479 |
| 73.04 | 2539 |
| 73.08 | 2462 |
| 73.12 | 2589 |
| 73.16 | 2536 |
| 73.2 | 2604 |
| 73.24 | 2583 |
| 73.28 | 2512 |
| 73.32 | 2534 |
| 73.36 | 2563 |
| 73.4 | 2589 |
| 73.44 | 2510 |
| 73.48 | 2692 |
| 73.52 | 2447 |
| 73.56 | 2470 |
| 73.6 | 2432 |
| 73.64 | 2385 |
| 73.68 | 2352 |
| 73.72 | 2368 |
| 73.76 | 2285 |
| 73.8 | 2340 |
| 73.84 | 2257 |
| 73.88 | 2298 |
| 73.92 | 2229 |
| 73.96 | 2208 |
| 74.0 | 2194 |
| 74.04 | 2196 |
| 74.08 | 2174 |
| 74.12 | 2101 |
| 74.16 | 2154 |
| 74.2 | 2108 |
| 74.24 | 2161 |
| 74.28 | 2072 |
| 74.32 | 2223 |
| 74.36 | 2118 |
| 74.4 | 2051 |
| 74.44 | 2005 |
| 74.48 | 2083 |
| 74.52 | 2018 |
| 74.56 | 2045 |
| 74.6 | 2051 |
| 74.64 | 2030 |
| 74.68 | 2015 |
| 74.72 | 2009 |
| 74.76 | 1984 |
| 74.8 | 1993 |
| 74.84 | 1952 |
| 74.88 | 1988 |
| 74.92 | 1973 |
| 74.96 | 2025 |
| 75.0 | 1978 |
| 75.04 | 2006 |
| 75.08 | 1947 |
| 75.12 | 1942 |
| 75.16 | 1992 |
| 75.2 | 1863 |
| 75.24 | 1897 |
| 75.28 | 1882 |
| 75.32 | 1860 |
| 75.36 | 1957 |
| 75.4 | 1903 |
| 75.44 | 1910 |
| 75.48 | 1899 |
| 75.52 | 1931 |
| 75.56 | 1895 |
| 75.6 | 1908 |
| 75.64 | 1838 |
| 75.68 | 1879 |
| 75.72 | 1936 |
| 75.76 | 1855 |
| 75.8 | 1934 |
| 75.84 | 1874 |
| 75.88 | 1879 |
| 75.92 | 1889 |
| 75.96 | 1939 |
| 76.0 | 1924 |
| 76.04 | 1870 |
| 76.08 | 1965 |
| 76.12 | 1938 |
| 76.16 | 1937 |
| 76.2 | 1923 |
| 76.24 | 1924 |
| 76.28 | 1892 |
| 76.32 | 1948 |
| 76.36 | 1972 |
| 76.4 | 1962 |
| 76.44 | 1953 |
| 76.48 | 2076 |
| 76.52 | 2032 |
| 76.56 | 1970 |
| 76.6 | 1956 |
| 76.64 | 1942 |
| 76.68 | 2052 |
| 76.72 | 2070 |
| 76.76 | 2066 |
| 76.8 | 1959 |
| 76.84 | 2022 |
| 76.88 | 2017 |
| 76.92 | 2123 |
| 76.96 | 2095 |
| 77.0 | 2083 |
| 77.04 | 2100 |
| 77.08 | 2180 |
| 77.12 | 2109 |
| 77.16 | 2197 |
| 77.2 | 2106 |
| 77.24 | 2204 |
| 77.28 | 2230 |
| 77.32 | 2207 |
| 77.36 | 2273 |
| 77.4 | 2306 |
| 77.44 | 2360 |
| 77.48 | 2293 |
| 77.52 | 2431 |
| 77.56 | 2452 |
| 77.6 | 2598 |
| 77.64 | 2499 |
| 77.68 | 2675 |
| 77.72 | 2778 |
| 77.76 | 2659 |
| 77.8 | 2909 |
| 77.84 | 2910 |
| 77.88 | 2926 |
| 77.92 | 3060 |
| 77.96 | 3026 |
| 78.0 | 3070 |
| 78.04 | 3128 |
| 78.08 | 3254 |
| 78.12 | 3240 |
| 78.16 | 3209 |
| 78.2 | 3349 |
| 78.24 | 3457 |
| 78.28 | 3280 |
| 78.32 | 3334 |
| 78.36 | 3327 |
| 78.4 | 3330 |
| 78.44 | 3372 |
| 78.48 | 3331 |
| 78.52 | 3368 |
| 78.56 | 3289 |
| 78.6 | 3280 |
| 78.64 | 3055 |
| 78.68 | 3133 |
| 78.72 | 3078 |
| 78.76 | 3116 |
| 78.8 | 3068 |
| 78.84 | 2992 |
| 78.88 | 2885 |
| 78.92 | 2875 |
| 78.96 | 2802 |
| 79.0 | 2751 |
| 79.04 | 2727 |
| 79.08 | 2743 |
| 79.12 | 2774 |
| 79.16 | 2784 |
| 79.2 | 2645 |
| 79.24 | 2765 |
| 79.28 | 2719 |
| 79.32 | 2696 |
| 79.36 | 2846 |
| 79.4 | 2752 |
| 79.44 | 2788 |
| 79.48 | 2823 |
| 79.52 | 2760 |
| 79.56 | 2935 |
| 79.6 | 2958 |
| 79.64 | 2954 |
| 79.68 | 3056 |
| 79.72 | 3118 |
| 79.76 | 3155 |
| 79.8 | 3191 |
| 79.84 | 3334 |
| 79.88 | 3389 |
| 79.92 | 3546 |
| 79.96 | 3614 |
| 80.0 | 3731 |